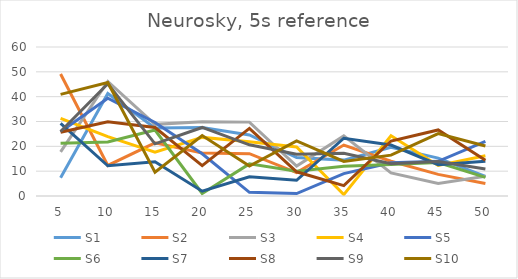
| Category | S1 | S2 | S3 | S4 | S5 | S6 | S7 | S8 | S9 | S10 |
|---|---|---|---|---|---|---|---|---|---|---|
| 5.0 | 7.35 | 49.14 | 17.76 | 31.24 | 25.85 | 21.22 | 29.27 | 25.66 | 25.97 | 40.93 |
| 10.0 | 41.25 | 12.3 | 46.14 | 23.89 | 39.39 | 21.77 | 12.16 | 29.92 | 45.2 | 45.68 |
| 15.0 | 27.43 | 21.43 | 28.85 | 17.68 | 29.62 | 26.56 | 13.78 | 27.59 | 21.01 | 9.6 |
| 20.0 | 27.54 | 17.28 | 29.94 | 23.6 | 16.99 | 1 | 1.93 | 12.23 | 27.6 | 24.35 |
| 25.0 | 24.58 | 17.06 | 29.75 | 21.8 | 1.46 | 12.93 | 7.77 | 27.21 | 20.61 | 12.06 |
| 30.0 | 15.48 | 9.41 | 12.08 | 19.76 | 0.98 | 10.01 | 6.31 | 9.74 | 16.84 | 22.2 |
| 35.0 | 14.45 | 20.51 | 24.2 | 0.57 | 9.01 | 12.01 | 23.27 | 4.2 | 17.22 | 13.94 |
| 40.0 | 19.61 | 14 | 9.3 | 24.24 | 13.4 | 12.67 | 20.51 | 22.14 | 12.99 | 16.46 |
| 45.0 | 15.24 | 8.71 | 5.08 | 12.32 | 13.97 | 13.45 | 12.62 | 26.61 | 13.85 | 25.12 |
| 50.0 | 7.9 | 5.04 | 7.97 | 16.23 | 21.96 | 7.52 | 13.97 | 14.39 | 10.91 | 20.16 |